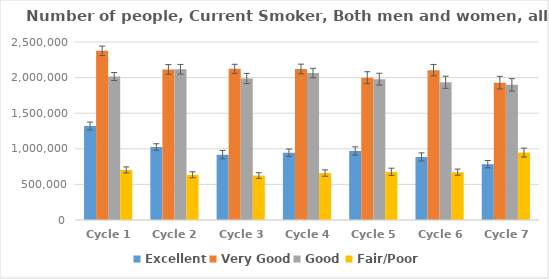
| Category | Excellent | Very Good | Good | Fair/Poor |
|---|---|---|---|---|
| Cycle 1 | 1319701 | 2375488 | 2014719 | 703289 |
| Cycle 2 | 1023889 | 2115199 | 2116938 | 634536 |
| Cycle 3 | 918153 | 2123156 | 1987641 | 624552 |
| Cycle 4 | 945489 | 2120764 | 2064118 | 659286 |
| Cycle 5 | 969590 | 1998578 | 1978222 | 677184 |
| Cycle 6 | 885698 | 2104656 | 1934317 | 671865 |
| Cycle 7 | 784076 | 1929238 | 1898238 | 947016 |